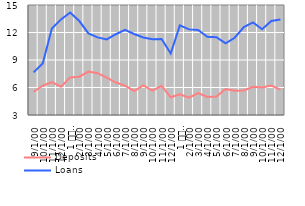
| Category | Deposits | Loans |
|---|---|---|
| 9 | 5.54 | 7.65 |
| 10 | 6.19 | 8.62 |
| 11 | 6.58 | 12.44 |
| 12 | 6.08 | 13.43 |
| 1 
2011 | 7.1 | 14.18 |
| 2 | 7.18 | 13.25 |
| 3 | 7.74 | 11.9 |
| 4 | 7.56 | 11.47 |
| 5 | 7.08 | 11.24 |
| 6 | 6.54 | 11.81 |
| 7 | 6.21 | 12.29 |
| 8 | 5.62 | 11.84 |
| 9 | 6.24 | 11.46 |
| 10 | 5.67 | 11.27 |
| 11 | 6.18 | 11.3 |
| 12 | 4.93 | 9.71 |
| 1 
2012 | 5.27 | 12.78 |
| 2 | 4.9 | 12.34 |
| 3 | 5.39 | 12.27 |
| 4 | 4.97 | 11.53 |
| 5 | 5.01 | 11.49 |
| 6 | 5.83 | 10.81 |
| 7 | 5.64 | 11.43 |
| 8 | 5.67 | 12.59 |
| 9 | 6.07 | 13.1 |
| 10 | 6.01 | 12.36 |
| 11 | 6.22 | 13.26 |
| 12 | 5.77 | 13.43 |